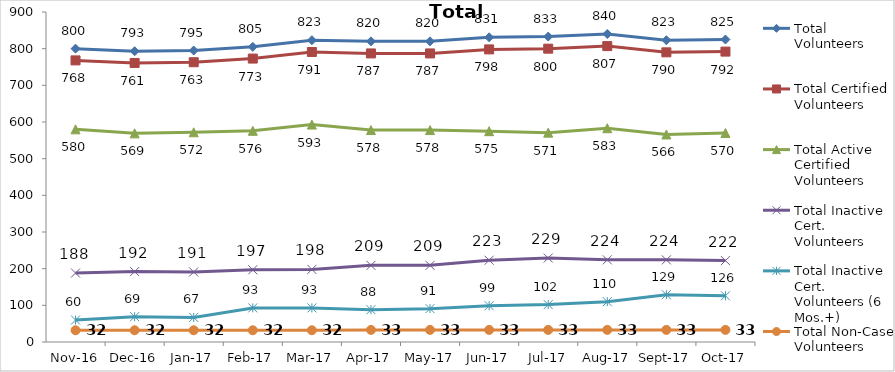
| Category | Total Volunteers | Total Certified Volunteers | Total Active Certified Volunteers | Total Inactive Cert. Volunteers | Total Inactive Cert. Volunteers (6 Mos.+) | Total Non-Case Volunteers |
|---|---|---|---|---|---|---|
| 2016-11-01 | 800 | 768 | 580 | 188 | 60 | 32 |
| 2016-12-01 | 793 | 761 | 569 | 192 | 69 | 32 |
| 2017-01-01 | 795 | 763 | 572 | 191 | 67 | 32 |
| 2017-02-01 | 805 | 773 | 576 | 197 | 93 | 32 |
| 2017-03-01 | 823 | 791 | 593 | 198 | 93 | 32 |
| 2017-04-01 | 820 | 787 | 578 | 209 | 88 | 33 |
| 2017-05-01 | 820 | 787 | 578 | 209 | 91 | 33 |
| 2017-06-01 | 831 | 798 | 575 | 223 | 99 | 33 |
| 2017-07-01 | 833 | 800 | 571 | 229 | 102 | 33 |
| 2017-08-01 | 840 | 807 | 583 | 224 | 110 | 33 |
| 2017-09-01 | 823 | 790 | 566 | 224 | 129 | 33 |
| 2017-10-01 | 825 | 792 | 570 | 222 | 126 | 33 |